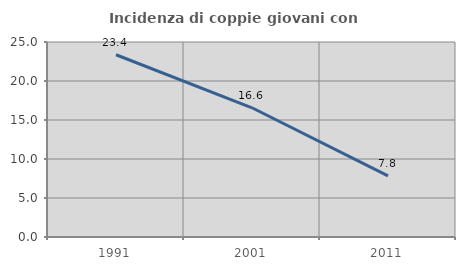
| Category | Incidenza di coppie giovani con figli |
|---|---|
| 1991.0 | 23.364 |
| 2001.0 | 16.566 |
| 2011.0 | 7.837 |